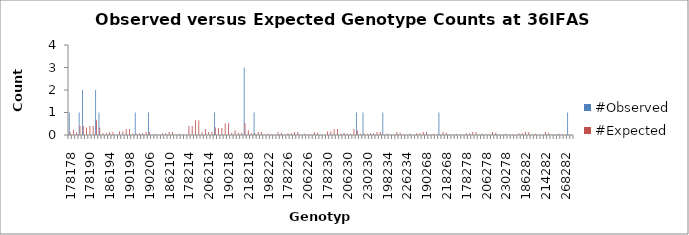
| Category | #Observed | #Expected |
|---|---|---|
| 178178.0 | 1 | 0.118 |
| 178182.0 | 0 | 0.237 |
| 182182.0 | 0 | 0.118 |
| 178186.0 | 1 | 0.395 |
| 182186.0 | 2 | 0.395 |
| 186186.0 | 0 | 0.329 |
| 178190.0 | 0 | 0.395 |
| 182190.0 | 0 | 0.395 |
| 186190.0 | 2 | 0.658 |
| 190190.0 | 1 | 0.329 |
| 178194.0 | 0 | 0.079 |
| 182194.0 | 0 | 0.079 |
| 186194.0 | 0 | 0.132 |
| 190194.0 | 0 | 0.132 |
| 194194.0 | 0 | 0.013 |
| 178198.0 | 0 | 0.158 |
| 182198.0 | 0 | 0.158 |
| 186198.0 | 0 | 0.263 |
| 190198.0 | 0 | 0.263 |
| 194198.0 | 0 | 0.053 |
| 198198.0 | 1 | 0.053 |
| 178206.0 | 0 | 0.079 |
| 182206.0 | 0 | 0.079 |
| 186206.0 | 0 | 0.132 |
| 190206.0 | 1 | 0.132 |
| 194206.0 | 0 | 0.026 |
| 198206.0 | 0 | 0.053 |
| 206206.0 | 0 | 0.013 |
| 178210.0 | 0 | 0.079 |
| 182210.0 | 0 | 0.079 |
| 186210.0 | 0 | 0.132 |
| 190210.0 | 0 | 0.132 |
| 194210.0 | 0 | 0.026 |
| 198210.0 | 0 | 0.053 |
| 206210.0 | 0 | 0.026 |
| 210210.0 | 0 | 0.013 |
| 178214.0 | 0 | 0.395 |
| 182214.0 | 0 | 0.395 |
| 186214.0 | 0 | 0.658 |
| 190214.0 | 0 | 0.658 |
| 194214.0 | 0 | 0.132 |
| 198214.0 | 0 | 0.263 |
| 206214.0 | 0 | 0.132 |
| 210214.0 | 0 | 0.132 |
| 214214.0 | 1 | 0.329 |
| 178218.0 | 0 | 0.316 |
| 182218.0 | 0 | 0.316 |
| 186218.0 | 0 | 0.526 |
| 190218.0 | 0 | 0.526 |
| 194218.0 | 0 | 0.105 |
| 198218.0 | 0 | 0.211 |
| 206218.0 | 0 | 0.105 |
| 210218.0 | 0 | 0.105 |
| 214218.0 | 3 | 0.526 |
| 218218.0 | 0 | 0.211 |
| 178222.0 | 0 | 0.079 |
| 182222.0 | 1 | 0.079 |
| 186222.0 | 0 | 0.132 |
| 190222.0 | 0 | 0.132 |
| 194222.0 | 0 | 0.026 |
| 198222.0 | 0 | 0.053 |
| 206222.0 | 0 | 0.026 |
| 210222.0 | 0 | 0.026 |
| 214222.0 | 0 | 0.132 |
| 218222.0 | 0 | 0.105 |
| 222222.0 | 0 | 0.013 |
| 178226.0 | 0 | 0.079 |
| 182226.0 | 0 | 0.079 |
| 186226.0 | 0 | 0.132 |
| 190226.0 | 0 | 0.132 |
| 194226.0 | 0 | 0.026 |
| 198226.0 | 0 | 0.053 |
| 206226.0 | 0 | 0.026 |
| 210226.0 | 0 | 0.026 |
| 214226.0 | 0 | 0.132 |
| 218226.0 | 0 | 0.105 |
| 222226.0 | 0 | 0.026 |
| 226226.0 | 0 | 0.013 |
| 178230.0 | 0 | 0.158 |
| 182230.0 | 0 | 0.158 |
| 186230.0 | 0 | 0.263 |
| 190230.0 | 0 | 0.263 |
| 194230.0 | 0 | 0.053 |
| 198230.0 | 0 | 0.105 |
| 206230.0 | 0 | 0.053 |
| 210230.0 | 0 | 0.053 |
| 214230.0 | 0 | 0.263 |
| 218230.0 | 1 | 0.211 |
| 222230.0 | 0 | 0.053 |
| 226230.0 | 1 | 0.053 |
| 230230.0 | 0 | 0.053 |
| 178234.0 | 0 | 0.079 |
| 182234.0 | 0 | 0.079 |
| 186234.0 | 0 | 0.132 |
| 190234.0 | 0 | 0.132 |
| 194234.0 | 1 | 0.026 |
| 198234.0 | 0 | 0.053 |
| 206234.0 | 0 | 0.026 |
| 210234.0 | 0 | 0.026 |
| 214234.0 | 0 | 0.132 |
| 218234.0 | 0 | 0.105 |
| 222234.0 | 0 | 0.026 |
| 226234.0 | 0 | 0.026 |
| 230234.0 | 0 | 0.053 |
| 234234.0 | 0 | 0.013 |
| 178268.0 | 0 | 0.079 |
| 182268.0 | 0 | 0.079 |
| 186268.0 | 0 | 0.132 |
| 190268.0 | 0 | 0.132 |
| 194268.0 | 0 | 0.026 |
| 198268.0 | 0 | 0.053 |
| 206268.0 | 0 | 0.026 |
| 210268.0 | 1 | 0.026 |
| 214268.0 | 0 | 0.132 |
| 218268.0 | 0 | 0.105 |
| 222268.0 | 0 | 0.026 |
| 226268.0 | 0 | 0.026 |
| 230268.0 | 0 | 0.053 |
| 234268.0 | 0 | 0.026 |
| 268268.0 | 0 | 0.013 |
| 178278.0 | 0 | 0.079 |
| 182278.0 | 0 | 0.079 |
| 186278.0 | 0 | 0.132 |
| 190278.0 | 0 | 0.132 |
| 194278.0 | 0 | 0.026 |
| 198278.0 | 0 | 0.053 |
| 206278.0 | 0 | 0.026 |
| 210278.0 | 0 | 0.026 |
| 214278.0 | 0 | 0.132 |
| 218278.0 | 0 | 0.105 |
| 222278.0 | 0 | 0.026 |
| 226278.0 | 0 | 0.026 |
| 230278.0 | 0 | 0.053 |
| 234278.0 | 0 | 0.026 |
| 268278.0 | 0 | 0.026 |
| 278278.0 | 0 | 0.013 |
| 178282.0 | 0 | 0.079 |
| 182282.0 | 0 | 0.079 |
| 186282.0 | 0 | 0.132 |
| 190282.0 | 0 | 0.132 |
| 194282.0 | 0 | 0.026 |
| 198282.0 | 0 | 0.053 |
| 206282.0 | 0 | 0.026 |
| 210282.0 | 0 | 0.026 |
| 214282.0 | 0 | 0.132 |
| 218282.0 | 0 | 0.105 |
| 222282.0 | 0 | 0.026 |
| 226282.0 | 0 | 0.026 |
| 230282.0 | 0 | 0.053 |
| 234282.0 | 0 | 0.026 |
| 268282.0 | 0 | 0.026 |
| 278282.0 | 1 | 0.026 |
| 282282.0 | 0 | 0.013 |